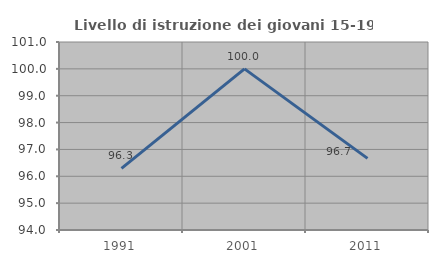
| Category | Livello di istruzione dei giovani 15-19 anni |
|---|---|
| 1991.0 | 96.296 |
| 2001.0 | 100 |
| 2011.0 | 96.667 |